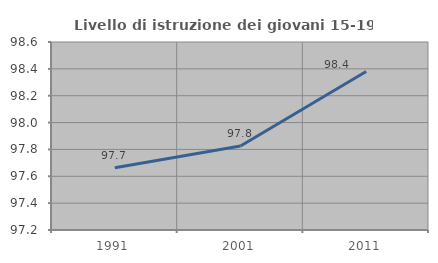
| Category | Livello di istruzione dei giovani 15-19 anni |
|---|---|
| 1991.0 | 97.664 |
| 2001.0 | 97.826 |
| 2011.0 | 98.38 |